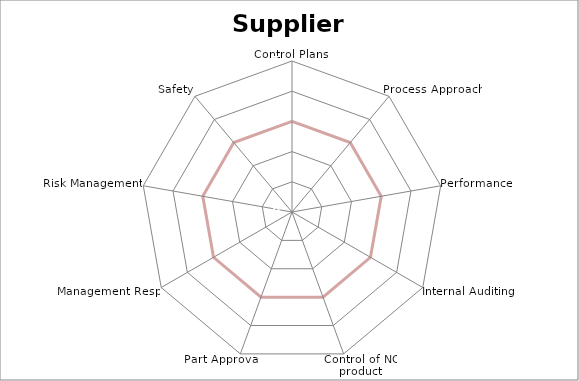
| Category | Series 0 | Series 1 | Series 2 |
|---|---|---|---|
| 0 |  | 0 | 3 |
| 1 |  | 0 | 3 |
| 2 |  | 0 | 3 |
| 3 |  | 0 | 3 |
| 4 |  | 0 | 3 |
| 5 |  | 0 | 3 |
| 6 |  | 0 | 3 |
| 7 |  | 0 | 3 |
| 8 |  | 0 | 3 |